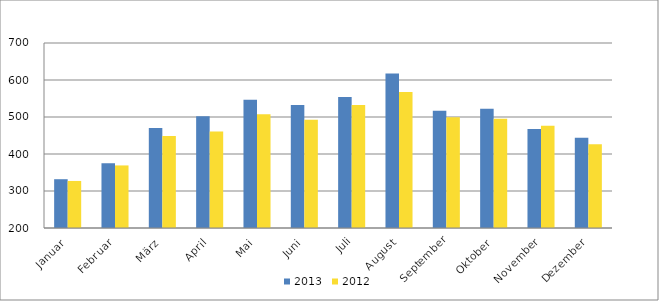
| Category | 2013 | 2012 |
|---|---|---|
| Januar | 331867 | 327129 |
| Februar | 375091 | 369119 |
| März | 470298 | 448801 |
| April | 502181 | 461060 |
| Mai | 546849 | 507440 |
| Juni | 532095 | 492662 |
| Juli | 554141 | 532632 |
| August | 617449 | 567353 |
| September | 516764 | 499466 |
| Oktober | 522055 | 495387 |
| November | 467791 | 476159 |
| Dezember | 443733 | 426436 |